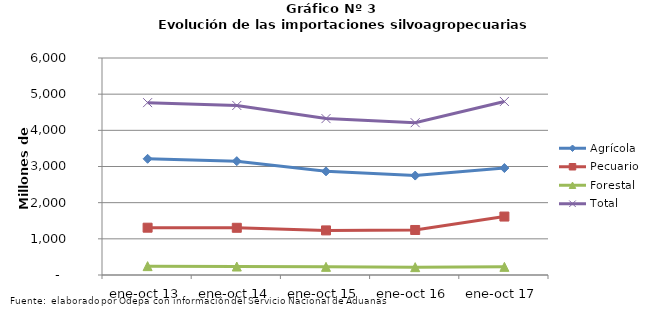
| Category | Agrícola | Pecuario | Forestal | Total |
|---|---|---|---|---|
| ene-oct 13 | 3212956 | 1307907 | 245082 | 4765945 |
| ene-oct 14 | 3147869 | 1305403 | 234454 | 4687726 |
| ene-oct 15 | 2865706 | 1233135 | 225417 | 4324258 |
| ene-oct 16 | 2749087 | 1245102 | 217006 | 4211195 |
| ene-oct 17 | 2957404 | 1615898 | 224699 | 4798001 |